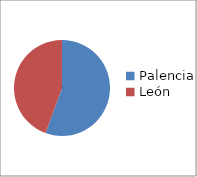
| Category | Series 0 |
|---|---|
| Palencia  | 5 |
| León | 4 |